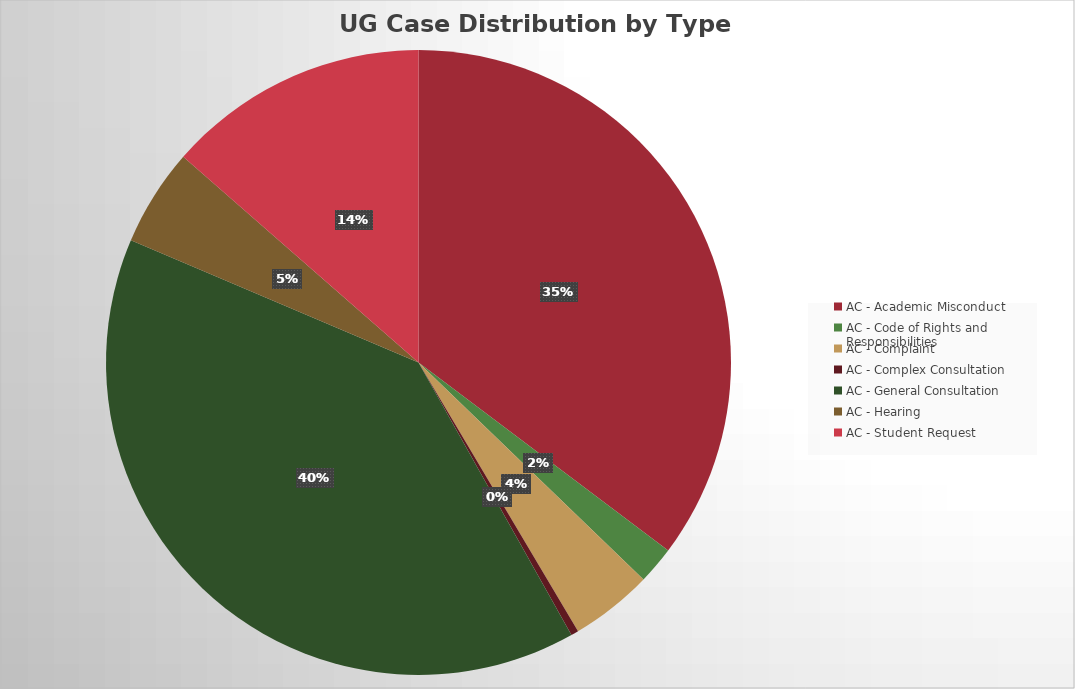
| Category | Series 0 |
|---|---|
| AC - Academic Misconduct | 91 |
| AC - Code of Rights and Responsibilities | 5 |
| AC - Complaint | 11 |
| AC - Complex Consultation | 1 |
| AC - General Consultation | 102 |
| AC - Hearing | 13 |
| AC - Student Request | 35 |